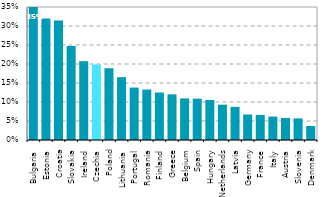
| Category | Series 0 |
|---|---|
| Bulgaria | 0.35 |
| Estonia | 0.32 |
| Croatia | 0.315 |
| Slovakia | 0.247 |
| Ireland | 0.207 |
| Czechia | 0.199 |
| Poland | 0.189 |
| Lithuania | 0.165 |
| Portugal | 0.138 |
| Romania | 0.133 |
| Finland | 0.125 |
| Greece | 0.12 |
| Belgium | 0.109 |
| Spain | 0.109 |
| Hungary | 0.105 |
| Netherlands | 0.093 |
| Latvia | 0.087 |
| Germany | 0.067 |
| France | 0.066 |
| Italy | 0.062 |
| Austria | 0.058 |
| Slovenia | 0.057 |
| Denmark | 0.037 |